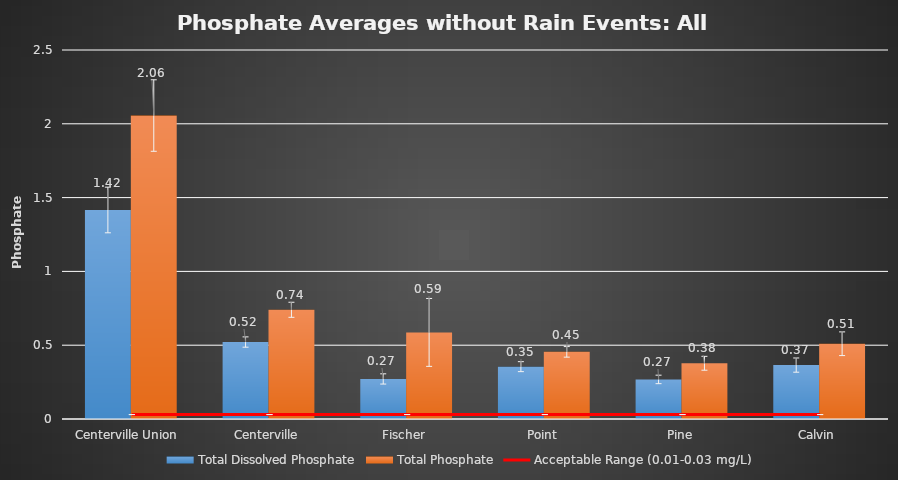
| Category | Total Dissolved Phosphate | Total Phosphate |
|---|---|---|
| Centerville Union  | 1.416 | 2.056 |
| Centerville | 0.521 | 0.74 |
| Fischer | 0.271 | 0.587 |
| Point | 0.355 | 0.455 |
| Pine | 0.268 | 0.377 |
| Calvin | 0.365 | 0.51 |